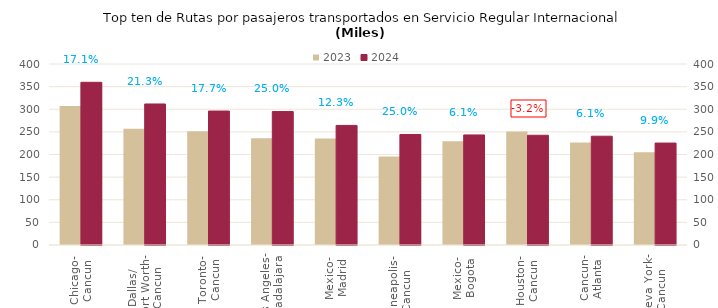
| Category | 2023 | 2024 |
|---|---|---|
| Chicago-
Cancun | 306.934 | 359.539 |
| Dallas/
Fort Worth-
Cancun | 256.89 | 311.654 |
| Toronto-
Cancun | 251.533 | 296 |
| Los Angeles-
Guadalajara | 235.897 | 294.946 |
| Mexico-
Madrid | 235.363 | 264.277 |
| Minneapolis-
Cancun | 195.375 | 244.217 |
| Mexico-
Bogota | 229.246 | 243.214 |
| Houston-
Cancun | 250.643 | 242.507 |
| Cancun-
Atlanta | 226.62 | 240.393 |
| Nueva York-
Cancun | 204.937 | 225.249 |